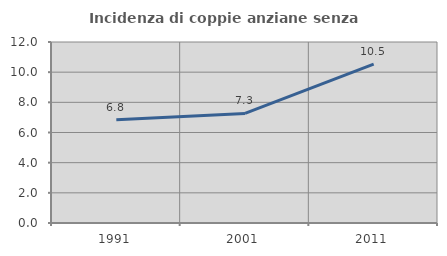
| Category | Incidenza di coppie anziane senza figli  |
|---|---|
| 1991.0 | 6.841 |
| 2001.0 | 7.267 |
| 2011.0 | 10.535 |